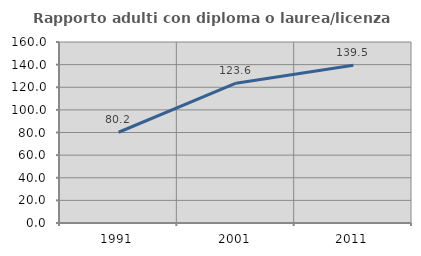
| Category | Rapporto adulti con diploma o laurea/licenza media  |
|---|---|
| 1991.0 | 80.218 |
| 2001.0 | 123.575 |
| 2011.0 | 139.494 |